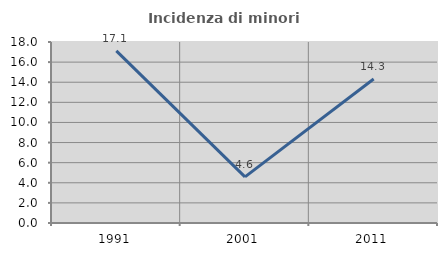
| Category | Incidenza di minori stranieri |
|---|---|
| 1991.0 | 17.117 |
| 2001.0 | 4.587 |
| 2011.0 | 14.32 |